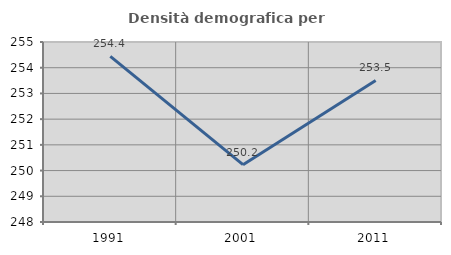
| Category | Densità demografica |
|---|---|
| 1991.0 | 254.444 |
| 2001.0 | 250.23 |
| 2011.0 | 253.507 |